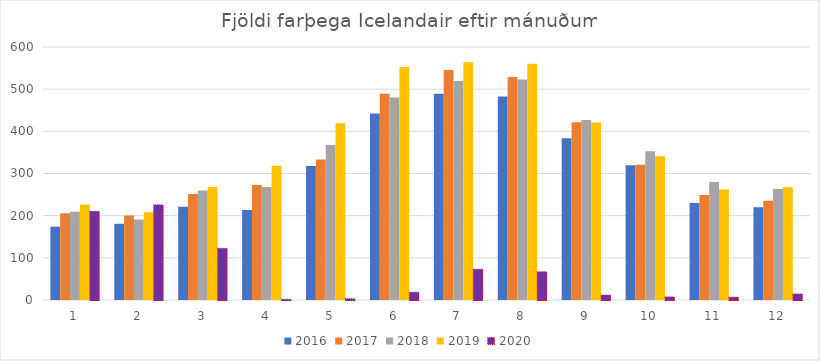
| Category | 2016 | 2017 | 2018 | 2019 | 2020 |
|---|---|---|---|---|---|
| 1.0 | 173822 | 205710 | 209398 | 226737 | 210257 |
| 2.0 | 180732 | 200289 | 190720 | 208252 | 225635 |
| 3.0 | 221330 | 251105 | 259947 | 267740 | 122623 |
| 4.0 | 213334 | 272733 | 267790 | 318310 | 1711 |
| 5.0 | 318002 | 333090 | 367530 | 419091 | 3125 |
| 6.0 | 442144 | 489408 | 480468 | 552791 | 18494 |
| 7.0 | 489291 | 545230 | 519332 | 563982 | 73159 |
| 8.0 | 482444 | 528885 | 522925 | 560094 | 67113 |
| 9.0 | 383888 | 421359 | 427100 | 421042 | 11869 |
| 10.0 | 319646 | 320745 | 352787 | 340674 | 7502 |
| 11.0 | 229892 | 249160 | 280037 | 261937 | 6965 |
| 12.0 | 220067 | 235164 | 263457 | 267225 | 14452 |